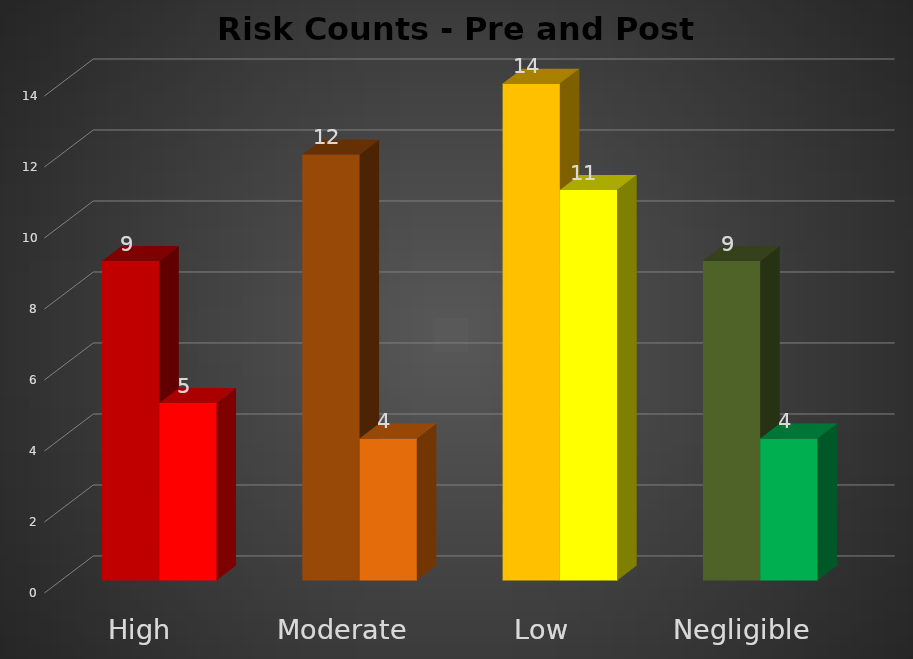
| Category | Pre-Mitigation | Post-Mitigation |
|---|---|---|
| High | 9 | 5 |
| Moderate | 12 | 4 |
| Low | 14 | 11 |
| Negligible | 9 | 4 |